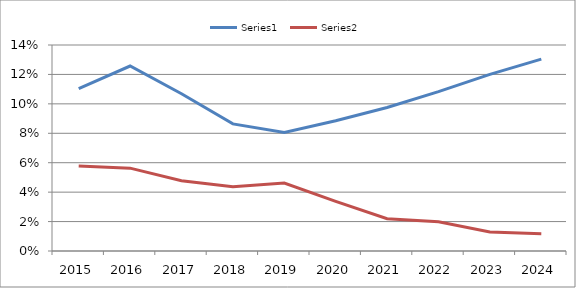
| Category | Series 0 | Series 1 |
|---|---|---|
| 2015.0 | 0.11 | 0.058 |
| 2016.0 | 0.126 | 0.056 |
| 2017.0 | 0.107 | 0.048 |
| 2018.0 | 0.086 | 0.044 |
| 2019.0 | 0.081 | 0.046 |
| 2020.0 | 0.088 | 0.034 |
| 2021.0 | 0.098 | 0.022 |
| 2022.0 | 0.108 | 0.02 |
| 2023.0 | 0.12 | 0.013 |
| 2024.0 | 0.13 | 0.012 |